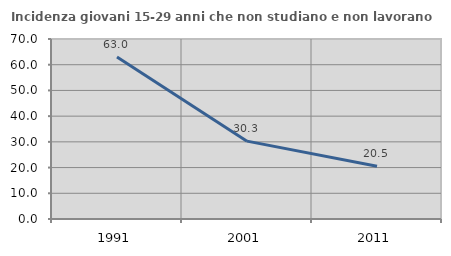
| Category | Incidenza giovani 15-29 anni che non studiano e non lavorano  |
|---|---|
| 1991.0 | 63.032 |
| 2001.0 | 30.275 |
| 2011.0 | 20.482 |